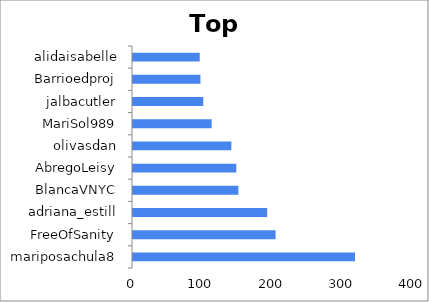
| Category | Series 0 |
|---|---|
| mariposachula8 | 316 |
| FreeOfSanity | 203 |
| adriana_estill | 191 |
| BlancaVNYC | 150 |
| AbregoLeisy | 147 |
| olivasdan | 140 |
| MariSol989 | 112 |
| jalbacutler | 100 |
| Barrioedproj | 96 |
| alidaisabelle | 95 |